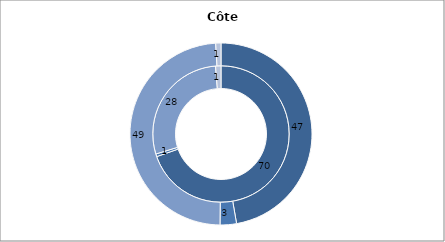
| Category | Immigrants | Native population |
|---|---|---|
| Employed | 69.62 | 47.26 |
| Unemployed | 0.64 | 2.92 |
| Non-active | 28.46 | 48.89 |
| Other | 1.28 | 0.93 |